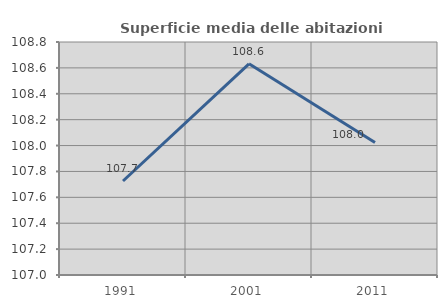
| Category | Superficie media delle abitazioni occupate |
|---|---|
| 1991.0 | 107.726 |
| 2001.0 | 108.631 |
| 2011.0 | 108.024 |